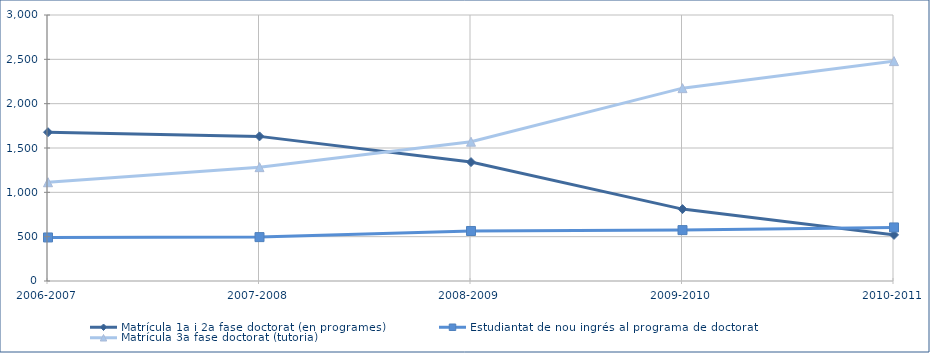
| Category | Matrícula 1a i 2a fase doctorat (en programes) | Estudiantat de nou ingrés al programa de doctorat | Matrícula 3a fase doctorat (tutoria) |
|---|---|---|---|
| 2006-2007 | 1678 | 491 | 1114 |
| 2007-2008 | 1631 | 495 | 1284 |
| 2008-2009 | 1341 | 564 | 1571 |
| 2009-2010 | 811 | 574 | 2175 |
| 2010-2011 | 520 | 604 | 2480 |